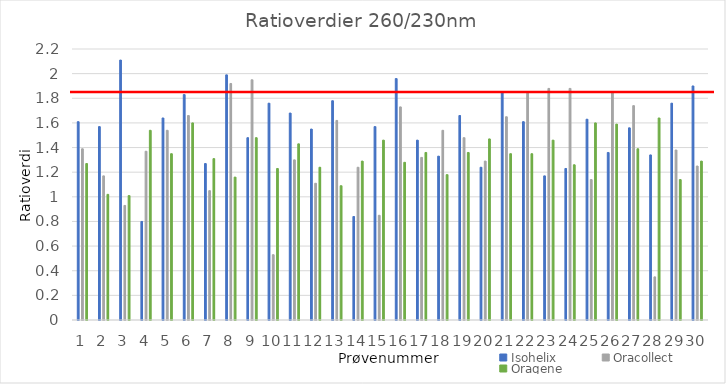
| Category | Isohelix | Oracollect | Oragene |
|---|---|---|---|
| 0 | 1.61 | 1.39 | 1.27 |
| 1 | 1.57 | 1.17 | 1.02 |
| 2 | 2.11 | 0.93 | 1.01 |
| 3 | 0.8 | 1.37 | 1.54 |
| 4 | 1.64 | 1.54 | 1.35 |
| 5 | 1.83 | 1.66 | 1.6 |
| 6 | 1.27 | 1.05 | 1.31 |
| 7 | 1.99 | 1.92 | 1.16 |
| 8 | 1.48 | 1.95 | 1.48 |
| 9 | 1.76 | 0.53 | 1.23 |
| 10 | 1.68 | 1.3 | 1.43 |
| 11 | 1.55 | 1.11 | 1.24 |
| 12 | 1.78 | 1.62 | 1.09 |
| 13 | 0.84 | 1.24 | 1.29 |
| 14 | 1.57 | 0.85 | 1.46 |
| 15 | 1.96 | 1.73 | 1.28 |
| 16 | 1.46 | 1.32 | 1.36 |
| 17 | 1.33 | 1.54 | 1.18 |
| 18 | 1.66 | 1.48 | 1.36 |
| 19 | 1.24 | 1.29 | 1.47 |
| 20 | 1.85 | 1.65 | 1.35 |
| 21 | 1.61 | 1.85 | 1.35 |
| 22 | 1.17 | 1.88 | 1.46 |
| 23 | 1.23 | 1.88 | 1.26 |
| 24 | 1.63 | 1.14 | 1.6 |
| 25 | 1.36 | 1.85 | 1.59 |
| 26 | 1.56 | 1.74 | 1.39 |
| 27 | 1.34 | 0.35 | 1.64 |
| 28 | 1.76 | 1.38 | 1.14 |
| 29 | 1.9 | 1.25 | 1.29 |